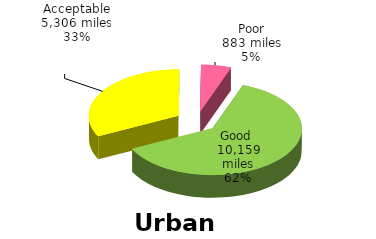
| Category | Urban |
|---|---|
| Good  | 10159 |
| Acceptable | 5306 |
| Poor | 883 |